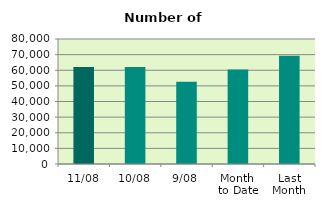
| Category | Series 0 |
|---|---|
| 11/08 | 62026 |
| 10/08 | 62070 |
| 9/08 | 52606 |
| Month 
to Date | 60500.5 |
| Last
Month | 69237.818 |